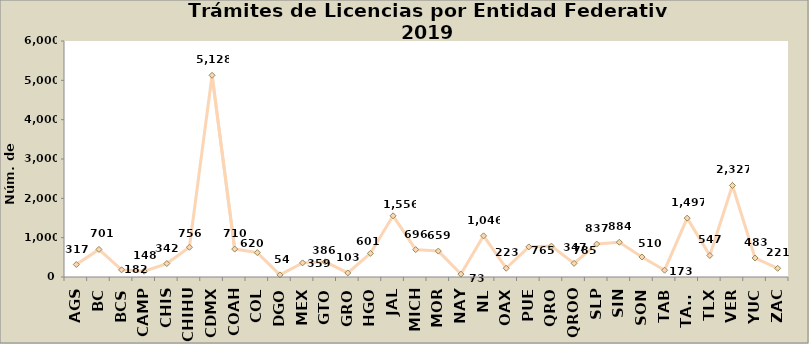
| Category | Series 0 |
|---|---|
| AGS | 317 |
| BC | 701 |
| BCS | 182 |
| CAMP | 148 |
| CHIS | 342 |
| CHIHU | 756 |
| CDMX | 5128 |
| COAH | 710 |
| COL | 620 |
| DGO | 54 |
| MEX | 359 |
| GTO | 386 |
| GRO | 103 |
| HGO | 601 |
| JAL | 1556 |
| MICH | 696 |
| MOR | 659 |
| NAY | 73 |
| NL | 1046 |
| OAX | 223 |
| PUE | 765 |
| QRO | 785 |
| QROO | 347 |
| SLP | 837 |
| SIN | 884 |
| SON | 510 |
| TAB | 173 |
| TAMS | 1497 |
| TLX | 547 |
| VER | 2327 |
| YUC | 483 |
| ZAC | 221 |